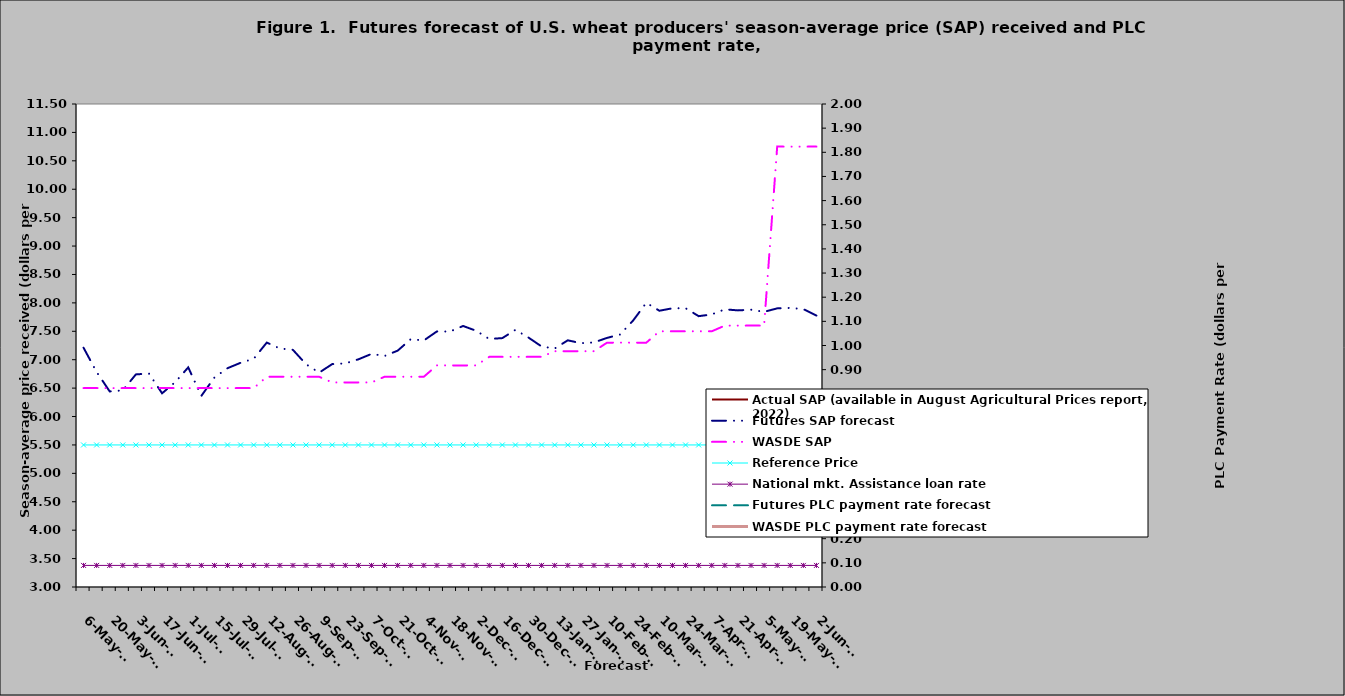
| Category | Actual SAP (available | Futures SAP forecast | WASDE SAP | Reference Price | National mkt. Assistance loan rate |
|---|---|---|---|---|---|
| 2021-05-06 |  | 7.211 | 6.5 | 5.5 | 3.38 |
| 2021-05-13 |  | 6.783 | 6.5 | 5.5 | 3.38 |
| 2021-05-20 |  | 6.442 | 6.5 | 5.5 | 3.38 |
| 2021-05-27 |  | 6.461 | 6.5 | 5.5 | 3.38 |
| 2021-06-03 |  | 6.741 | 6.5 | 5.5 | 3.38 |
| 2021-06-10 |  | 6.757 | 6.5 | 5.5 | 3.38 |
| 2021-06-17 |  | 6.408 | 6.5 | 5.5 | 3.38 |
| 2021-06-24 |  | 6.605 | 6.5 | 5.5 | 3.38 |
| 2021-07-01 |  | 6.865 | 6.5 | 5.5 | 3.38 |
| 2021-07-08 |  | 6.363 | 6.5 | 5.5 | 3.38 |
| 2021-07-15 |  | 6.686 | 6.5 | 5.5 | 3.38 |
| 2021-07-22 |  | 6.851 | 6.5 | 5.5 | 3.38 |
| 2021-07-29 |  | 6.946 | 6.5 | 5.5 | 3.38 |
| 2021-08-05 |  | 7.016 | 6.5 | 5.5 | 3.38 |
| 2021-08-12 |  | 7.302 | 6.7 | 5.5 | 3.38 |
| 2021-08-19 |  | 7.197 | 6.7 | 5.5 | 3.38 |
| 2021-08-26 |  | 7.173 | 6.7 | 5.5 | 3.38 |
| 2021-09-02 |  | 6.921 | 6.7 | 5.5 | 3.38 |
| 2021-09-09 |  | 6.772 | 6.7 | 5.5 | 3.38 |
| 2021-09-16 |  | 6.923 | 6.6 | 5.5 | 3.38 |
| 2021-09-23 |  | 6.934 | 6.6 | 5.5 | 3.38 |
| 2021-09-30 |  | 7.007 | 6.6 | 5.5 | 3.38 |
| 2021-10-07 |  | 7.102 | 6.6 | 5.5 | 3.38 |
| 2021-10-14 |  | 7.066 | 6.7 | 5.5 | 3.38 |
| 2021-10-21 |  | 7.159 | 6.7 | 5.5 | 3.38 |
| 2021-10-28 |  | 7.36 | 6.7 | 5.5 | 3.38 |
| 2021-11-04 |  | 7.339 | 6.7 | 5.5 | 3.38 |
| 2021-11-11 |  | 7.498 | 6.9 | 5.5 | 3.38 |
| 2021-11-18 |  | 7.496 | 6.9 | 5.5 | 3.38 |
| 2021-11-25 |  | 7.594 | 6.9 | 5.5 | 3.38 |
| 2021-12-02 |  | 7.509 | 6.9 | 5.5 | 3.38 |
| 2021-12-09 |  | 7.365 | 7.05 | 5.5 | 3.38 |
| 2021-12-16 |  | 7.38 | 7.05 | 5.5 | 3.38 |
| 2021-12-23 |  | 7.525 | 7.05 | 5.5 | 3.38 |
| 2021-12-30 |  | 7.389 | 7.05 | 5.5 | 3.38 |
| 2022-01-06 |  | 7.232 | 7.05 | 5.5 | 3.38 |
| 2022-01-13 |  | 7.197 | 7.15 | 5.5 | 3.38 |
| 2022-01-20 |  | 7.341 | 7.15 | 5.5 | 3.38 |
| 2022-01-27 |  | 7.291 | 7.15 | 5.5 | 3.38 |
| 2022-02-03 |  | 7.304 | 7.15 | 5.5 | 3.38 |
| 2022-02-10 |  | 7.384 | 7.3 | 5.5 | 3.38 |
| 2022-02-17 |  | 7.444 | 7.3 | 5.5 | 3.38 |
| 2022-02-24 |  | 7.692 | 7.3 | 5.5 | 3.38 |
| 2022-03-03 |  | 8.001 | 7.3 | 5.5 | 3.38 |
| 2022-03-10 |  | 7.862 | 7.5 | 5.5 | 3.38 |
| 2022-03-17 |  | 7.905 | 7.5 | 5.5 | 3.38 |
| 2022-03-24 |  | 7.906 | 7.5 | 5.5 | 3.38 |
| 2022-03-31 |  | 7.766 | 7.5 | 5.5 | 3.38 |
| 2022-04-07 |  | 7.797 | 7.5 | 5.5 | 3.38 |
| 2022-04-14 |  | 7.887 | 7.6 | 5.5 | 3.38 |
| 2022-04-21 |  | 7.868 | 7.6 | 5.5 | 3.38 |
| 2022-04-28 |  | 7.88 | 7.6 | 5.5 | 3.38 |
| 2022-05-05 |  | 7.843 | 7.6 | 5.5 | 3.38 |
| 2022-05-12 |  | 7.903 | 10.75 | 5.5 | 3.38 |
| 2022-05-19 |  | 7.911 | 10.75 | 5.5 | 3.38 |
| 2022-05-26 |  | 7.89 | 10.75 | 5.5 | 3.38 |
| 2022-06-02 |  | 7.777 | 10.75 | 5.5 | 3.38 |